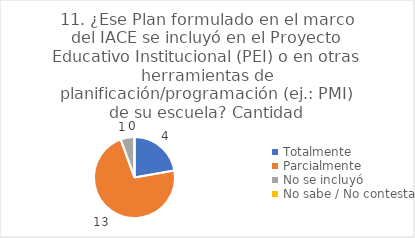
| Category | 11. ¿Ese Plan formulado en el marco del IACE se incluyó en el Proyecto Educativo Institucional (PEI) o en otras herramientas de planificación/programación (ej.: PMI) de su escuela? |
|---|---|
| Totalmente  | 0.222 |
| Parcialmente  | 0.722 |
| No se incluyó  | 0.056 |
| No sabe / No contesta | 0 |